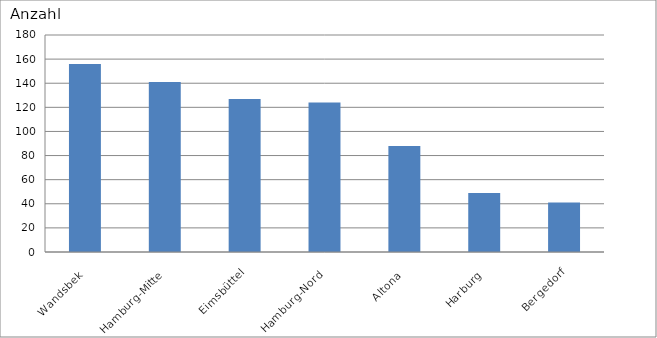
| Category | Wandsbek Hamburg-Mitte Eimsbüttel Hamburg-Nord Altona Harburg Bergedorf |
|---|---|
| Wandsbek | 156 |
| Hamburg-Mitte | 141 |
| Eimsbüttel | 127 |
| Hamburg-Nord | 124 |
| Altona | 88 |
| Harburg | 49 |
| Bergedorf | 41 |